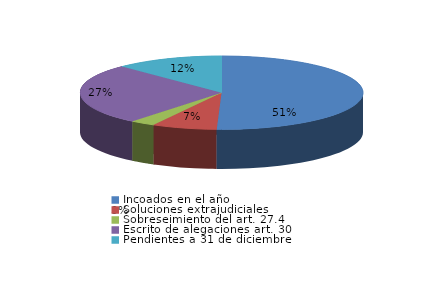
| Category | Series 0 |
|---|---|
| Incoados en el año | 423 |
| Soluciones extrajudiciales | 62 |
| Sobreseimiento del art. 27.4 | 24 |
| Escrito de alegaciones art. 30 | 224 |
| Pendientes a 31 de diciembre | 104 |